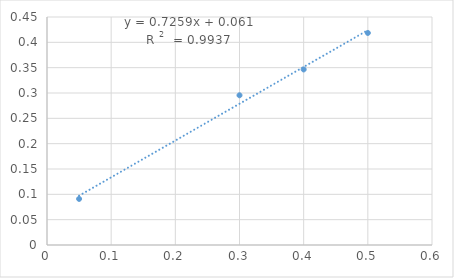
| Category | Series 0 |
|---|---|
| 0.05 | 0.091 |
| 0.3 | 0.296 |
| 0.4 | 0.347 |
| 0.5 | 0.418 |